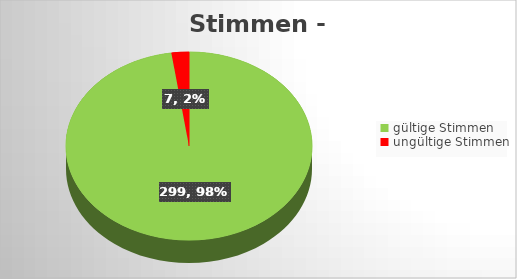
| Category | Series 0 |
|---|---|
| gültige Stimmen | 299 |
| ungültige Stimmen | 7 |